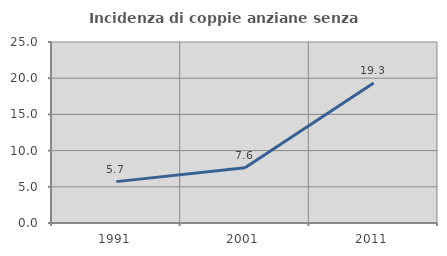
| Category | Incidenza di coppie anziane senza figli  |
|---|---|
| 1991.0 | 5.714 |
| 2001.0 | 7.619 |
| 2011.0 | 19.328 |